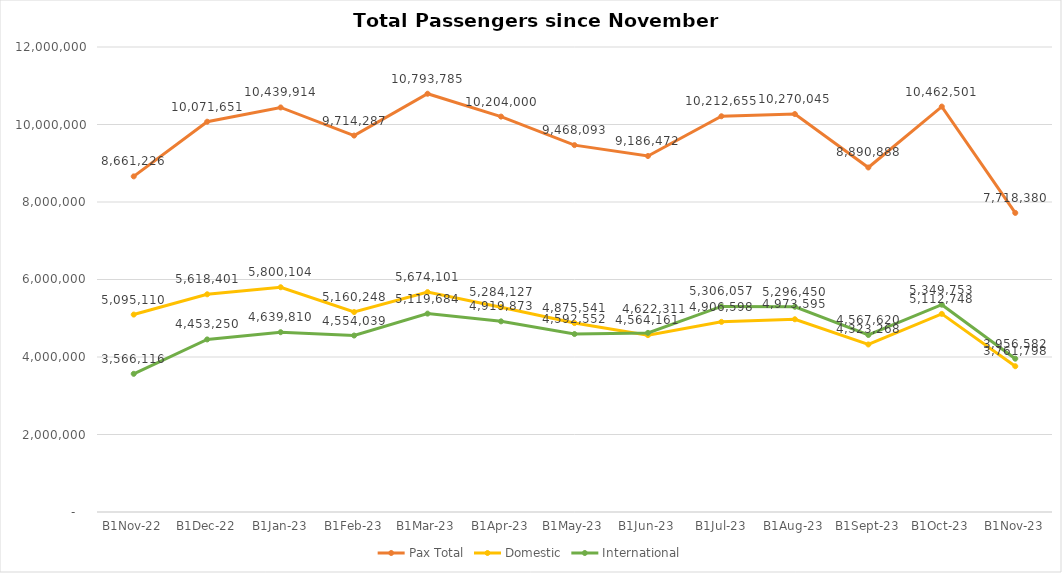
| Category | Pax Total | Domestic | International |
|---|---|---|---|
| 2022-11-01 | 8661226 | 5095110 | 3566116 |
| 2022-12-01 | 10071651 | 5618401 | 4453250 |
| 2023-01-01 | 10439914 | 5800104 | 4639810 |
| 2023-02-01 | 9714287 | 5160248 | 4554039 |
| 2023-03-01 | 10793785 | 5674101 | 5119684 |
| 2023-04-01 | 10204000 | 5284127 | 4919873 |
| 2023-05-01 | 9468093 | 4875541 | 4592552 |
| 2023-06-01 | 9186472 | 4564161 | 4622311 |
| 2023-07-01 | 10212655 | 4906598 | 5306057 |
| 2023-08-01 | 10270045 | 4973595 | 5296450 |
| 2023-09-01 | 8890888 | 4323268 | 4567620 |
| 2023-10-01 | 10462501 | 5112748 | 5349753 |
| 2023-11-01 | 7718380 | 3761798 | 3956582 |